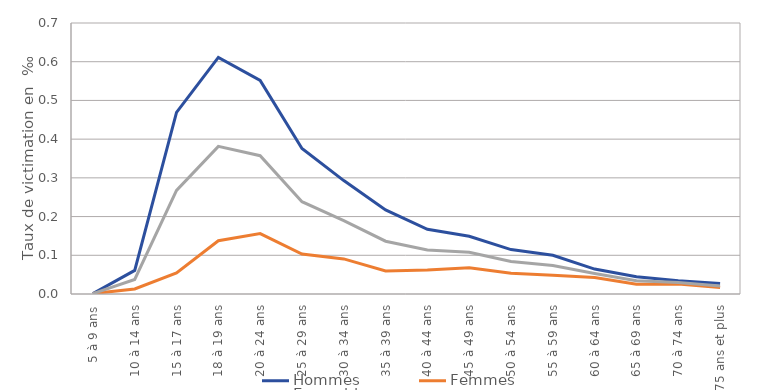
| Category | Hommes | Femmes | Ensemble |
|---|---|---|---|
| 5 à 9 ans | 0.001 | 0.001 | 0.001 |
| 10 à 14 ans | 0.061 | 0.013 | 0.038 |
| 15 à 17 ans | 0.469 | 0.055 | 0.268 |
| 18 à 19 ans | 0.611 | 0.138 | 0.381 |
| 20 à 24 ans | 0.551 | 0.156 | 0.357 |
| 25 à 29 ans | 0.376 | 0.103 | 0.238 |
| 30 à 34 ans | 0.293 | 0.091 | 0.189 |
| 35 à 39 ans | 0.217 | 0.06 | 0.136 |
| 40 à 44 ans | 0.167 | 0.062 | 0.114 |
| 45 à 49 ans | 0.149 | 0.068 | 0.108 |
| 50 à 54 ans | 0.115 | 0.054 | 0.084 |
| 55 à 59 ans | 0.1 | 0.048 | 0.073 |
| 60 à 64 ans | 0.064 | 0.043 | 0.053 |
| 65 à 69 ans | 0.045 | 0.025 | 0.034 |
| 70 à 74 ans | 0.034 | 0.026 | 0.03 |
| 75 ans et plus | 0.027 | 0.017 | 0.021 |